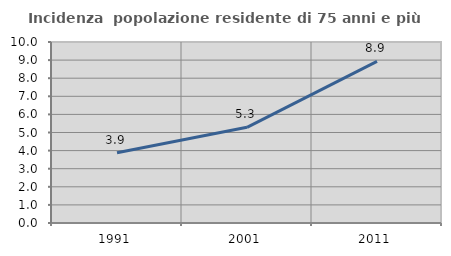
| Category | Incidenza  popolazione residente di 75 anni e più |
|---|---|
| 1991.0 | 3.881 |
| 2001.0 | 5.285 |
| 2011.0 | 8.932 |